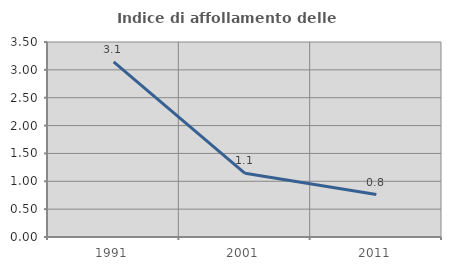
| Category | Indice di affollamento delle abitazioni  |
|---|---|
| 1991.0 | 3.145 |
| 2001.0 | 1.142 |
| 2011.0 | 0.762 |